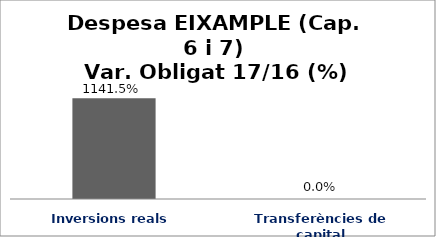
| Category | Series 0 |
|---|---|
| Inversions reals | 11.415 |
| Transferències de capital | 0 |